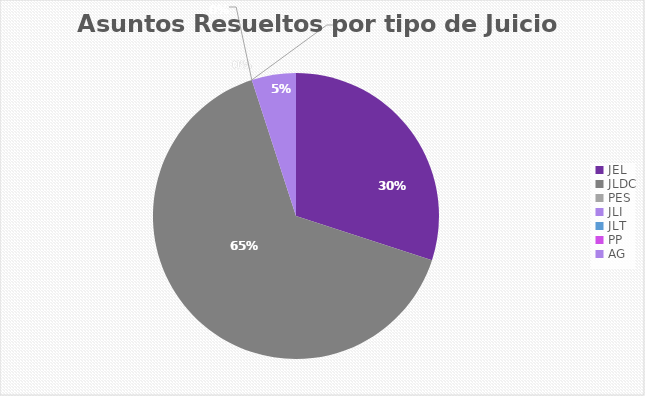
| Category | Asuntos Resueltos por tipo de Juicio  DICIEMBRE |
|---|---|
| JEL | 6 |
| JLDC | 13 |
| PES | 0 |
| JLI | 0 |
| JLT | 0 |
| PP | 0 |
| AG | 1 |